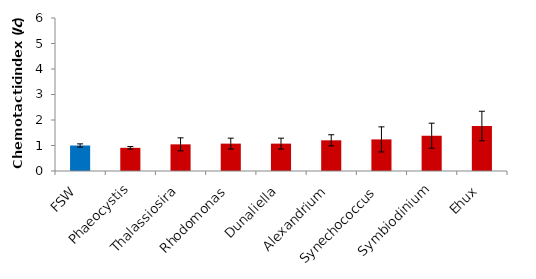
| Category | Series 0 |
|---|---|
| FSW | 1 |
| Phaeocystis | 0.909 |
| Thalassiosira | 1.045 |
| Rhodomonas | 1.073 |
| Dunaliella | 1.073 |
| Alexandrium | 1.203 |
| Synechococcus | 1.239 |
| Symbiodinium | 1.383 |
| Ehux | 1.763 |